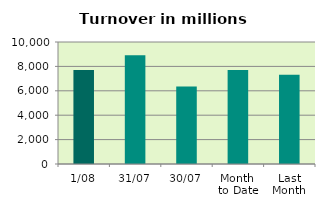
| Category | Series 0 |
|---|---|
| 1/08 | 7701.882 |
| 31/07 | 8922.073 |
| 30/07 | 6345.014 |
| Month 
to Date | 7701.882 |
| Last
Month | 7313.522 |